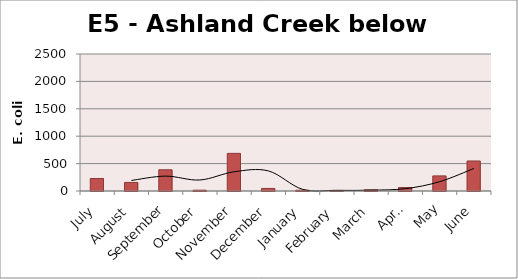
| Category | E. coli MPN |
|---|---|
| July | 228.2 |
| August | 156.5 |
| September | 387.3 |
| October | 14.6 |
| November | 686.7 |
| December | 46.5 |
| January | 14.3 |
| February | 9.5 |
| March | 20.9 |
| April | 63.8 |
| May | 275.5 |
| June | 547.5 |